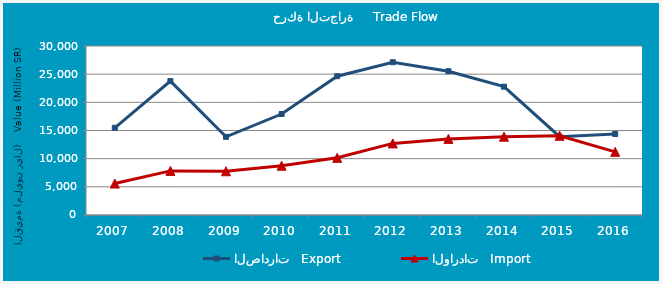
| Category | الصادرات   Export | الواردات   Import |
|---|---|---|
| 2007.0 | 15480.428 | 5581.722 |
| 2008.0 | 23765.198 | 7832.031 |
| 2009.0 | 13884.424 | 7764.077 |
| 2010.0 | 17924.118 | 8753.333 |
| 2011.0 | 24641.185 | 10149.065 |
| 2012.0 | 27123.048 | 12707.459 |
| 2013.0 | 25528.344 | 13507.864 |
| 2014.0 | 22781.533 | 13907.018 |
| 2015.0 | 13896.374 | 14059.367 |
| 2016.0 | 14379.024 | 11211.236 |